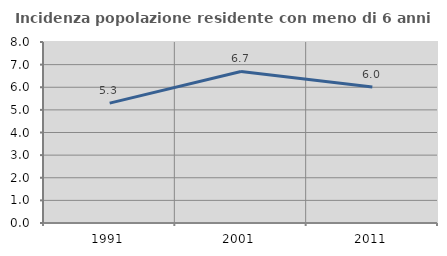
| Category | Incidenza popolazione residente con meno di 6 anni |
|---|---|
| 1991.0 | 5.299 |
| 2001.0 | 6.696 |
| 2011.0 | 6.011 |